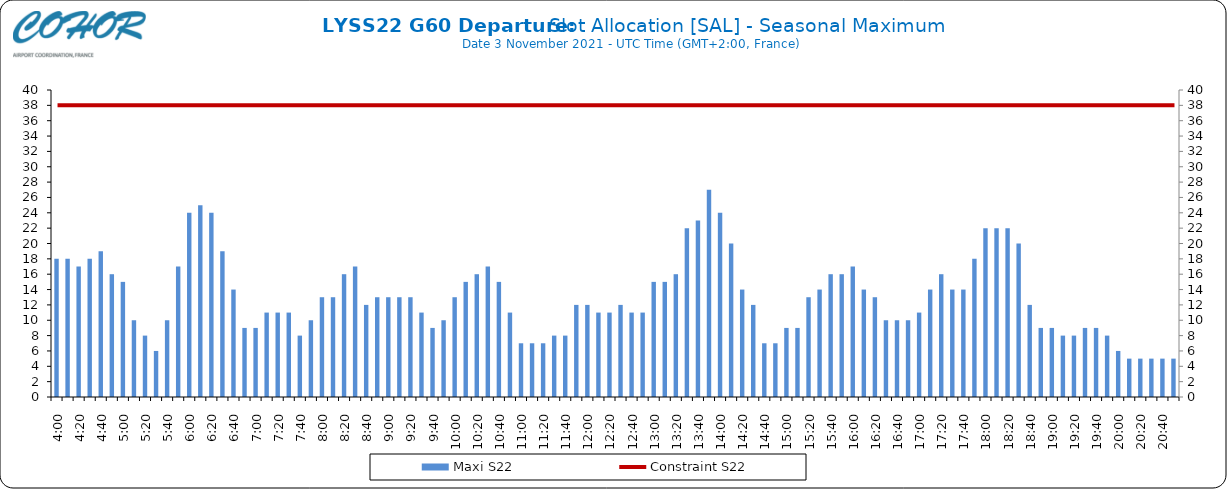
| Category | Maxi S22 |
|---|---|
| 0.16666666666666666 | 18 |
| 0.17361111111111113 | 18 |
| 0.18055555555555555 | 17 |
| 0.1875 | 18 |
| 0.19444444444444445 | 19 |
| 0.20138888888888887 | 16 |
| 0.20833333333333334 | 15 |
| 0.2152777777777778 | 10 |
| 0.2222222222222222 | 8 |
| 0.22916666666666666 | 6 |
| 0.23611111111111113 | 10 |
| 0.24305555555555555 | 17 |
| 0.25 | 24 |
| 0.2569444444444445 | 25 |
| 0.2638888888888889 | 24 |
| 0.2708333333333333 | 19 |
| 0.2777777777777778 | 14 |
| 0.2847222222222222 | 9 |
| 0.2916666666666667 | 9 |
| 0.2986111111111111 | 11 |
| 0.3055555555555555 | 11 |
| 0.3125 | 11 |
| 0.3194444444444445 | 8 |
| 0.3263888888888889 | 10 |
| 0.3333333333333333 | 13 |
| 0.34027777777777773 | 13 |
| 0.34722222222222227 | 16 |
| 0.3541666666666667 | 17 |
| 0.3611111111111111 | 12 |
| 0.3680555555555556 | 13 |
| 0.375 | 13 |
| 0.3819444444444444 | 13 |
| 0.3888888888888889 | 13 |
| 0.3958333333333333 | 11 |
| 0.40277777777777773 | 9 |
| 0.40972222222222227 | 10 |
| 0.4166666666666667 | 13 |
| 0.4236111111111111 | 15 |
| 0.4305555555555556 | 16 |
| 0.4375 | 17 |
| 0.4444444444444444 | 15 |
| 0.4513888888888889 | 11 |
| 0.4583333333333333 | 7 |
| 0.46527777777777773 | 7 |
| 0.47222222222222227 | 7 |
| 0.4791666666666667 | 8 |
| 0.4861111111111111 | 8 |
| 0.4930555555555556 | 12 |
| 0.5 | 12 |
| 0.5069444444444444 | 11 |
| 0.513888888888889 | 11 |
| 0.5208333333333334 | 12 |
| 0.5277777777777778 | 11 |
| 0.5347222222222222 | 11 |
| 0.5416666666666666 | 15 |
| 0.548611111111111 | 15 |
| 0.5555555555555556 | 16 |
| 0.5625 | 22 |
| 0.5694444444444444 | 23 |
| 0.576388888888889 | 27 |
| 0.5833333333333334 | 24 |
| 0.5902777777777778 | 20 |
| 0.5972222222222222 | 14 |
| 0.6041666666666666 | 12 |
| 0.611111111111111 | 7 |
| 0.6180555555555556 | 7 |
| 0.625 | 9 |
| 0.6319444444444444 | 9 |
| 0.638888888888889 | 13 |
| 0.6458333333333334 | 14 |
| 0.6527777777777778 | 16 |
| 0.6597222222222222 | 16 |
| 0.6666666666666666 | 17 |
| 0.6736111111111112 | 14 |
| 0.6805555555555555 | 13 |
| 0.6875 | 10 |
| 0.6944444444444445 | 10 |
| 0.7013888888888888 | 10 |
| 0.7083333333333334 | 11 |
| 0.7152777777777778 | 14 |
| 0.7222222222222222 | 16 |
| 0.7291666666666666 | 14 |
| 0.7361111111111112 | 14 |
| 0.7430555555555555 | 18 |
| 0.75 | 22 |
| 0.7569444444444445 | 22 |
| 0.7638888888888888 | 22 |
| 0.7708333333333334 | 20 |
| 0.7777777777777778 | 12 |
| 0.7847222222222222 | 9 |
| 0.7916666666666666 | 9 |
| 0.7986111111111112 | 8 |
| 0.8055555555555555 | 8 |
| 0.8125 | 9 |
| 0.8194444444444445 | 9 |
| 0.8263888888888888 | 8 |
| 0.8333333333333334 | 6 |
| 0.8402777777777778 | 5 |
| 0.8472222222222222 | 5 |
| 0.8541666666666666 | 5 |
| 0.8611111111111112 | 5 |
| 0.8680555555555555 | 5 |